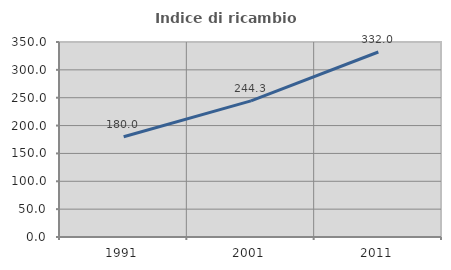
| Category | Indice di ricambio occupazionale  |
|---|---|
| 1991.0 | 179.96 |
| 2001.0 | 244.317 |
| 2011.0 | 332.038 |